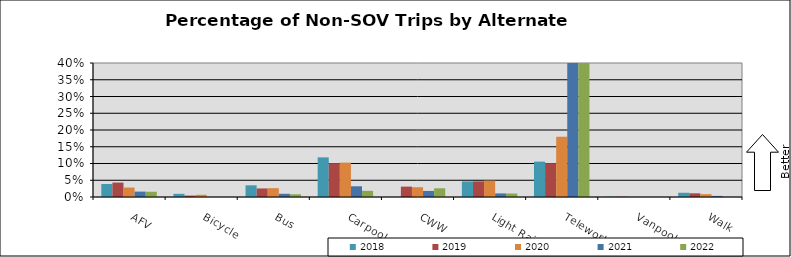
| Category | 2018 | 2019 | 2020 | 2021 | 2022 |
|---|---|---|---|---|---|
| AFV | 0.039 | 0.043 | 0.028 | 0.016 | 0.016 |
| Bicycle | 0.01 | 0.004 | 0.007 | 0 | 0 |
| Bus | 0.035 | 0.026 | 0.026 | 0.01 | 0.008 |
| Carpool | 0.118 | 0.101 | 0.103 | 0.032 | 0.018 |
| CWW | 0 | 0.031 | 0.029 | 0.018 | 0.026 |
| Light Rail | 0.046 | 0.047 | 0.049 | 0.011 | 0.01 |
| Telework | 0.106 | 0.101 | 0.18 | 0.761 | 0.689 |
| Vanpool | 0.001 | 0.001 | 0 | 0 | 0 |
| Walk | 0.013 | 0.011 | 0.008 | 0.003 | 0 |